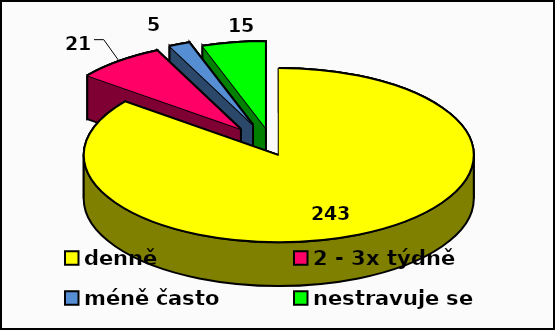
| Category | Series 0 |
|---|---|
| denně | 243 |
| 2 - 3x týdně | 21 |
| méně často | 5 |
| nestravuje se  | 15 |